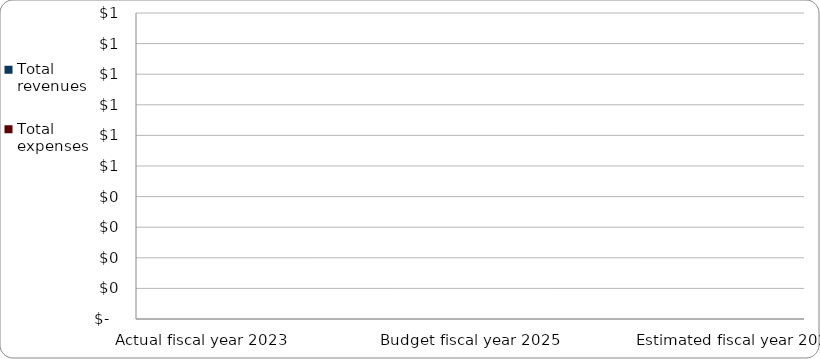
| Category | Series 1 | Total revenues | Total expenses |
|---|---|---|---|
| Actual fiscal year 2023 |  | 0 | 0 |
| Actual (estimated) fiscal year 2024 |  | 0 | 0 |
| Budget fiscal year 2025 |  | 0 | 0 |
| Estimated fiscal year 2026 |  | 0 | 0 |
| Estimated fiscal year 2027 |  | 0 | 0 |